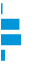
| Category | Series 0 |
|---|---|
| 0 | 0.013 |
| 1 | 0.435 |
| 2 | 0.477 |
| 3 | 0.076 |